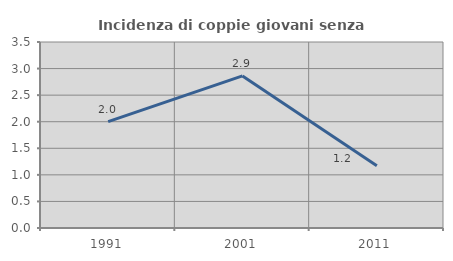
| Category | Incidenza di coppie giovani senza figli |
|---|---|
| 1991.0 | 2.003 |
| 2001.0 | 2.861 |
| 2011.0 | 1.171 |